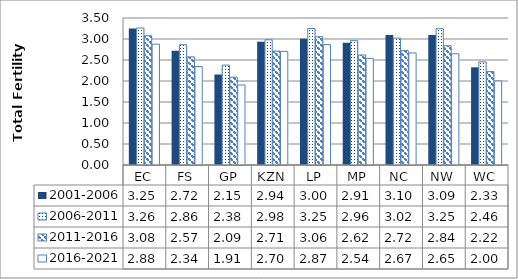
| Category | 2001-2006 | 2006-2011 | 2011-2016 | 2016-2021 |
|---|---|---|---|---|
| EC | 3.249 | 3.263 | 3.078 | 2.876 |
| FS | 2.722 | 2.864 | 2.574 | 2.344 |
| GP | 2.152 | 2.379 | 2.09 | 1.906 |
| KZN | 2.935 | 2.981 | 2.712 | 2.705 |
| LP | 3.005 | 3.25 | 3.055 | 2.866 |
| MP | 2.913 | 2.961 | 2.62 | 2.54 |
| NC | 3.096 | 3.021 | 2.724 | 2.668 |
| NW | 3.094 | 3.246 | 2.84 | 2.648 |
| WC | 2.326 | 2.456 | 2.225 | 2.002 |